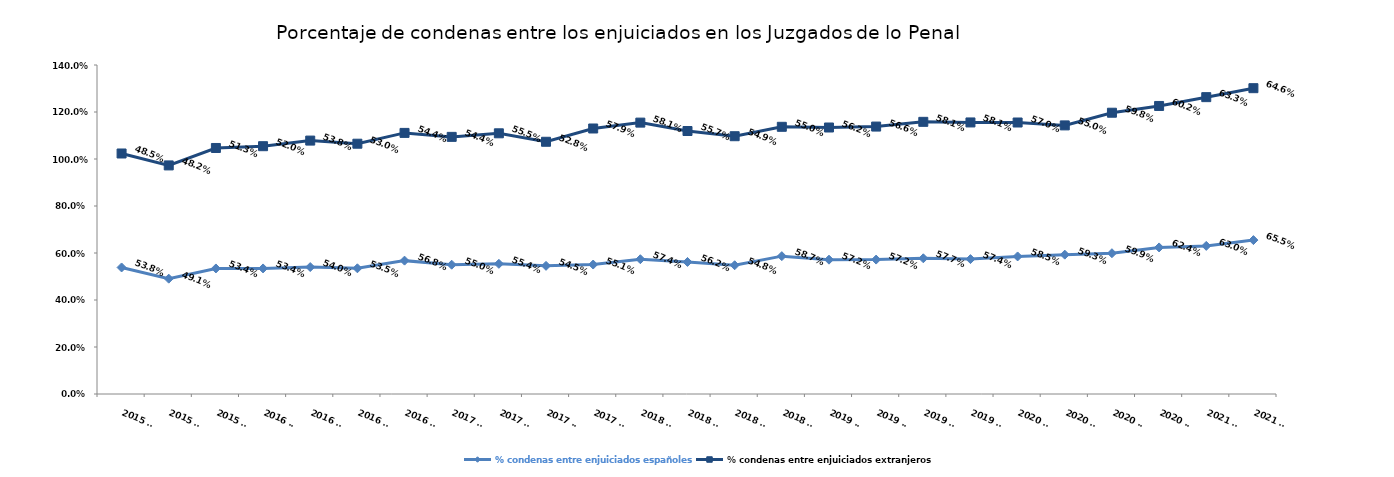
| Category | % condenas entre enjuiciados españoles | % condenas entre enjuiciados extranjeros |
|---|---|---|
| 2015 T2 | 0.538 | 0.485 |
| 2015 T3 | 0.491 | 0.482 |
| 2015 T4 | 0.534 | 0.513 |
| 2016 T1 | 0.534 | 0.52 |
| 2016 T2 | 0.54 | 0.538 |
| 2016 T3 | 0.535 | 0.53 |
| 2016 T4 | 0.568 | 0.544 |
| 2017 T1 | 0.55 | 0.544 |
| 2017 T2 | 0.554 | 0.555 |
| 2017 T3 | 0.545 | 0.528 |
| 2017 T4 | 0.551 | 0.579 |
| 2018 T1 | 0.574 | 0.581 |
| 2018 T2 | 0.562 | 0.557 |
| 2018 T3 | 0.548 | 0.549 |
| 2018 T4 | 0.587 | 0.55 |
| 2019 T1 | 0.572 | 0.562 |
| 2019 T2 | 0.572 | 0.566 |
| 2019 T3 | 0.577 | 0.581 |
| 2019 T4 | 0.574 | 0.581 |
| 2020 T1 | 0.585 | 0.57 |
| 2020 T2 | 0.593 | 0.55 |
| 2020 T3 | 0.599 | 0.598 |
| 2020 T4 | 0.624 | 0.602 |
| 2021 T1 | 0.63 | 0.633 |
| 2021 T2 | 0.655 | 0.646 |